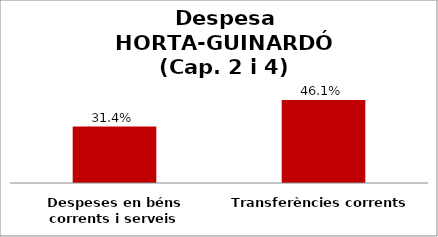
| Category | Series 0 |
|---|---|
| Despeses en béns corrents i serveis | 0.314 |
| Transferències corrents | 0.461 |